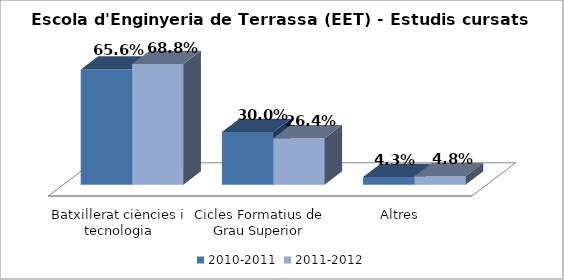
| Category | 2010-2011 | 2011-2012 |
|---|---|---|
| Batxillerat ciències i tecnologia | 0.656 | 0.688 |
| Cicles Formatius de Grau Superior | 0.3 | 0.264 |
| Altres | 0.043 | 0.048 |